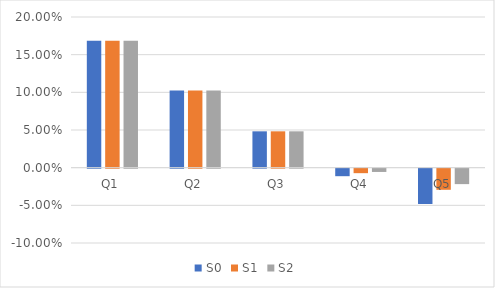
| Category | S0 | S1 | S2 |
|---|---|---|---|
| Q1 | 0.169 | 0.169 | 0.169 |
| Q2 | 0.103 | 0.103 | 0.103 |
| Q3 | 0.048 | 0.048 | 0.048 |
| Q4 | -0.01 | -0.006 | -0.004 |
| Q5 | -0.047 | -0.028 | -0.021 |